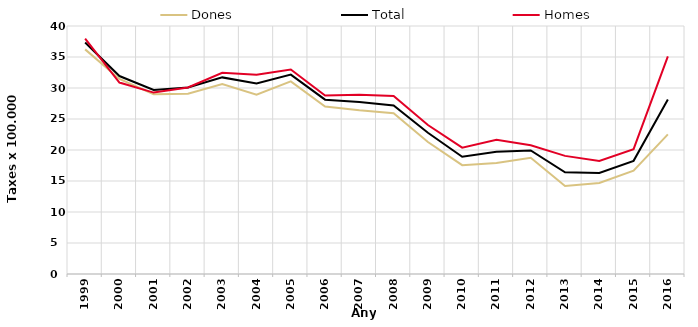
| Category | Dones | Total | Homes |
|---|---|---|---|
| 1999.0 | 36.23 | 37.34 | 37.97 |
| 2000.0 | 31.47 | 31.93 | 30.88 |
| 2001.0 | 29.01 | 29.69 | 29.26 |
| 2002.0 | 29.07 | 30.09 | 30.09 |
| 2003.0 | 30.63 | 31.71 | 32.46 |
| 2004.0 | 28.91 | 30.74 | 32.15 |
| 2005.0 | 31.06 | 32.16 | 32.98 |
| 2006.0 | 27.01 | 28.12 | 28.8 |
| 2007.0 | 26.4 | 27.75 | 28.91 |
| 2008.0 | 25.93 | 27.19 | 28.71 |
| 2009.0 | 21.29 | 22.78 | 24.03 |
| 2010.0 | 17.55 | 18.92 | 20.38 |
| 2011.0 | 17.92 | 19.73 | 21.65 |
| 2012.0 | 18.74 | 19.93 | 20.75 |
| 2013.0 | 14.19 | 16.41 | 19.05 |
| 2014.0 | 14.67 | 16.28 | 18.23 |
| 2015.0 | 16.67 | 18.25 | 20.13 |
| 2016.0 | 22.52 | 28.15 | 35.11 |